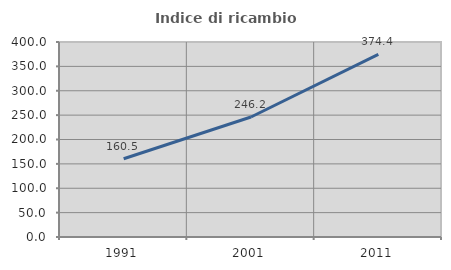
| Category | Indice di ricambio occupazionale  |
|---|---|
| 1991.0 | 160.494 |
| 2001.0 | 246.154 |
| 2011.0 | 374.419 |